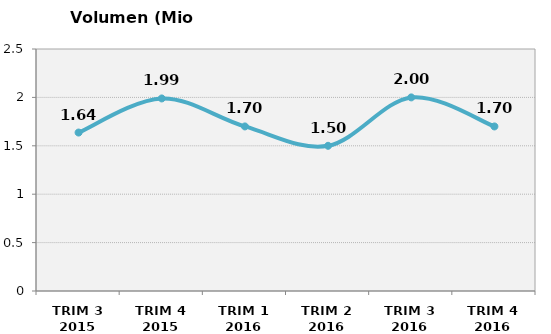
| Category | Volumen (Mio consumiciones) |
|---|---|
| TRIM 3 2015 | 1.637 |
| TRIM 4 2015 | 1.989 |
| TRIM 1 2016 | 1.7 |
| TRIM 2 2016 | 1.5 |
| TRIM 3 2016 | 2 |
| TRIM 4 2016 | 1.7 |